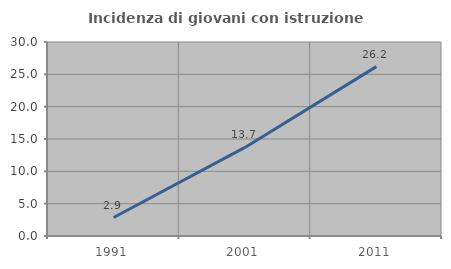
| Category | Incidenza di giovani con istruzione universitaria |
|---|---|
| 1991.0 | 2.857 |
| 2001.0 | 13.699 |
| 2011.0 | 26.19 |